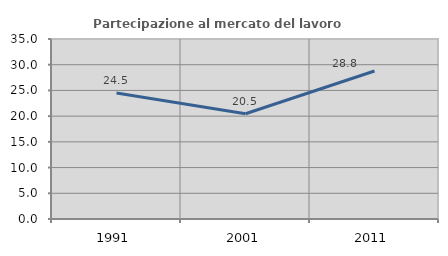
| Category | Partecipazione al mercato del lavoro  femminile |
|---|---|
| 1991.0 | 24.506 |
| 2001.0 | 20.464 |
| 2011.0 | 28.782 |